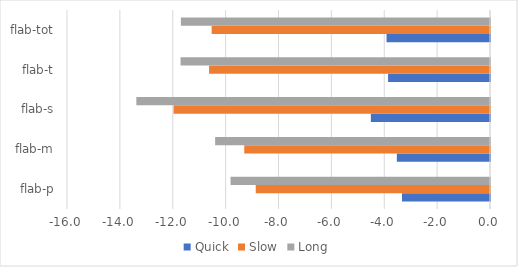
| Category | Quick | Slow | Long |
|---|---|---|---|
| flab-p | -3.328 | -8.86 | -9.814 |
| flab-m | -3.523 | -9.296 | -10.397 |
| flab-s | -4.507 | -11.97 | -13.377 |
| flab-t | -3.856 | -10.627 | -11.705 |
| flab-tot | -3.914 | -10.529 | -11.692 |